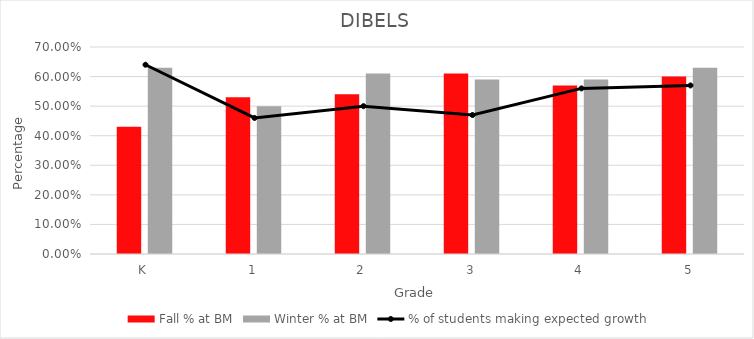
| Category | Fall % at BM | Winter % at BM |
|---|---|---|
| K | 0.43 | 0.63 |
| 1 | 0.53 | 0.5 |
| 2 | 0.54 | 0.61 |
| 3 | 0.61 | 0.59 |
| 4 | 0.57 | 0.59 |
| 5 | 0.6 | 0.63 |